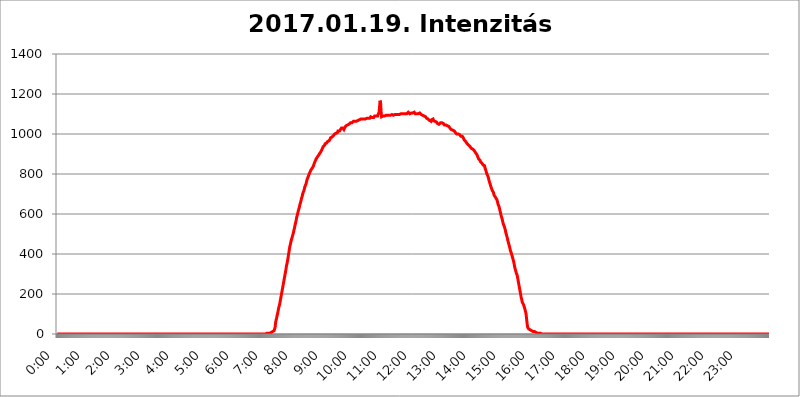
| Category | 2017.01.19. Intenzitás [W/m^2] |
|---|---|
| 0.0 | 0 |
| 0.0006944444444444445 | 0 |
| 0.001388888888888889 | 0 |
| 0.0020833333333333333 | 0 |
| 0.002777777777777778 | 0 |
| 0.003472222222222222 | 0 |
| 0.004166666666666667 | 0 |
| 0.004861111111111111 | 0 |
| 0.005555555555555556 | 0 |
| 0.0062499999999999995 | 0 |
| 0.006944444444444444 | 0 |
| 0.007638888888888889 | 0 |
| 0.008333333333333333 | 0 |
| 0.009027777777777779 | 0 |
| 0.009722222222222222 | 0 |
| 0.010416666666666666 | 0 |
| 0.011111111111111112 | 0 |
| 0.011805555555555555 | 0 |
| 0.012499999999999999 | 0 |
| 0.013194444444444444 | 0 |
| 0.013888888888888888 | 0 |
| 0.014583333333333332 | 0 |
| 0.015277777777777777 | 0 |
| 0.015972222222222224 | 0 |
| 0.016666666666666666 | 0 |
| 0.017361111111111112 | 0 |
| 0.018055555555555557 | 0 |
| 0.01875 | 0 |
| 0.019444444444444445 | 0 |
| 0.02013888888888889 | 0 |
| 0.020833333333333332 | 0 |
| 0.02152777777777778 | 0 |
| 0.022222222222222223 | 0 |
| 0.02291666666666667 | 0 |
| 0.02361111111111111 | 0 |
| 0.024305555555555556 | 0 |
| 0.024999999999999998 | 0 |
| 0.025694444444444447 | 0 |
| 0.02638888888888889 | 0 |
| 0.027083333333333334 | 0 |
| 0.027777777777777776 | 0 |
| 0.02847222222222222 | 0 |
| 0.029166666666666664 | 0 |
| 0.029861111111111113 | 0 |
| 0.030555555555555555 | 0 |
| 0.03125 | 0 |
| 0.03194444444444445 | 0 |
| 0.03263888888888889 | 0 |
| 0.03333333333333333 | 0 |
| 0.034027777777777775 | 0 |
| 0.034722222222222224 | 0 |
| 0.035416666666666666 | 0 |
| 0.036111111111111115 | 0 |
| 0.03680555555555556 | 0 |
| 0.0375 | 0 |
| 0.03819444444444444 | 0 |
| 0.03888888888888889 | 0 |
| 0.03958333333333333 | 0 |
| 0.04027777777777778 | 0 |
| 0.04097222222222222 | 0 |
| 0.041666666666666664 | 0 |
| 0.042361111111111106 | 0 |
| 0.04305555555555556 | 0 |
| 0.043750000000000004 | 0 |
| 0.044444444444444446 | 0 |
| 0.04513888888888889 | 0 |
| 0.04583333333333334 | 0 |
| 0.04652777777777778 | 0 |
| 0.04722222222222222 | 0 |
| 0.04791666666666666 | 0 |
| 0.04861111111111111 | 0 |
| 0.049305555555555554 | 0 |
| 0.049999999999999996 | 0 |
| 0.05069444444444445 | 0 |
| 0.051388888888888894 | 0 |
| 0.052083333333333336 | 0 |
| 0.05277777777777778 | 0 |
| 0.05347222222222222 | 0 |
| 0.05416666666666667 | 0 |
| 0.05486111111111111 | 0 |
| 0.05555555555555555 | 0 |
| 0.05625 | 0 |
| 0.05694444444444444 | 0 |
| 0.057638888888888885 | 0 |
| 0.05833333333333333 | 0 |
| 0.05902777777777778 | 0 |
| 0.059722222222222225 | 0 |
| 0.06041666666666667 | 0 |
| 0.061111111111111116 | 0 |
| 0.06180555555555556 | 0 |
| 0.0625 | 0 |
| 0.06319444444444444 | 0 |
| 0.06388888888888888 | 0 |
| 0.06458333333333334 | 0 |
| 0.06527777777777778 | 0 |
| 0.06597222222222222 | 0 |
| 0.06666666666666667 | 0 |
| 0.06736111111111111 | 0 |
| 0.06805555555555555 | 0 |
| 0.06874999999999999 | 0 |
| 0.06944444444444443 | 0 |
| 0.07013888888888889 | 0 |
| 0.07083333333333333 | 0 |
| 0.07152777777777779 | 0 |
| 0.07222222222222223 | 0 |
| 0.07291666666666667 | 0 |
| 0.07361111111111111 | 0 |
| 0.07430555555555556 | 0 |
| 0.075 | 0 |
| 0.07569444444444444 | 0 |
| 0.0763888888888889 | 0 |
| 0.07708333333333334 | 0 |
| 0.07777777777777778 | 0 |
| 0.07847222222222222 | 0 |
| 0.07916666666666666 | 0 |
| 0.0798611111111111 | 0 |
| 0.08055555555555556 | 0 |
| 0.08125 | 0 |
| 0.08194444444444444 | 0 |
| 0.08263888888888889 | 0 |
| 0.08333333333333333 | 0 |
| 0.08402777777777777 | 0 |
| 0.08472222222222221 | 0 |
| 0.08541666666666665 | 0 |
| 0.08611111111111112 | 0 |
| 0.08680555555555557 | 0 |
| 0.08750000000000001 | 0 |
| 0.08819444444444445 | 0 |
| 0.08888888888888889 | 0 |
| 0.08958333333333333 | 0 |
| 0.09027777777777778 | 0 |
| 0.09097222222222222 | 0 |
| 0.09166666666666667 | 0 |
| 0.09236111111111112 | 0 |
| 0.09305555555555556 | 0 |
| 0.09375 | 0 |
| 0.09444444444444444 | 0 |
| 0.09513888888888888 | 0 |
| 0.09583333333333333 | 0 |
| 0.09652777777777777 | 0 |
| 0.09722222222222222 | 0 |
| 0.09791666666666667 | 0 |
| 0.09861111111111111 | 0 |
| 0.09930555555555555 | 0 |
| 0.09999999999999999 | 0 |
| 0.10069444444444443 | 0 |
| 0.1013888888888889 | 0 |
| 0.10208333333333335 | 0 |
| 0.10277777777777779 | 0 |
| 0.10347222222222223 | 0 |
| 0.10416666666666667 | 0 |
| 0.10486111111111111 | 0 |
| 0.10555555555555556 | 0 |
| 0.10625 | 0 |
| 0.10694444444444444 | 0 |
| 0.1076388888888889 | 0 |
| 0.10833333333333334 | 0 |
| 0.10902777777777778 | 0 |
| 0.10972222222222222 | 0 |
| 0.1111111111111111 | 0 |
| 0.11180555555555556 | 0 |
| 0.11180555555555556 | 0 |
| 0.1125 | 0 |
| 0.11319444444444444 | 0 |
| 0.11388888888888889 | 0 |
| 0.11458333333333333 | 0 |
| 0.11527777777777777 | 0 |
| 0.11597222222222221 | 0 |
| 0.11666666666666665 | 0 |
| 0.1173611111111111 | 0 |
| 0.11805555555555557 | 0 |
| 0.11944444444444445 | 0 |
| 0.12013888888888889 | 0 |
| 0.12083333333333333 | 0 |
| 0.12152777777777778 | 0 |
| 0.12222222222222223 | 0 |
| 0.12291666666666667 | 0 |
| 0.12291666666666667 | 0 |
| 0.12361111111111112 | 0 |
| 0.12430555555555556 | 0 |
| 0.125 | 0 |
| 0.12569444444444444 | 0 |
| 0.12638888888888888 | 0 |
| 0.12708333333333333 | 0 |
| 0.16875 | 0 |
| 0.12847222222222224 | 0 |
| 0.12916666666666668 | 0 |
| 0.12986111111111112 | 0 |
| 0.13055555555555556 | 0 |
| 0.13125 | 0 |
| 0.13194444444444445 | 0 |
| 0.1326388888888889 | 0 |
| 0.13333333333333333 | 0 |
| 0.13402777777777777 | 0 |
| 0.13402777777777777 | 0 |
| 0.13472222222222222 | 0 |
| 0.13541666666666666 | 0 |
| 0.1361111111111111 | 0 |
| 0.13749999999999998 | 0 |
| 0.13819444444444443 | 0 |
| 0.1388888888888889 | 0 |
| 0.13958333333333334 | 0 |
| 0.14027777777777778 | 0 |
| 0.14097222222222222 | 0 |
| 0.14166666666666666 | 0 |
| 0.1423611111111111 | 0 |
| 0.14305555555555557 | 0 |
| 0.14375000000000002 | 0 |
| 0.14444444444444446 | 0 |
| 0.1451388888888889 | 0 |
| 0.1451388888888889 | 0 |
| 0.14652777777777778 | 0 |
| 0.14722222222222223 | 0 |
| 0.14791666666666667 | 0 |
| 0.1486111111111111 | 0 |
| 0.14930555555555555 | 0 |
| 0.15 | 0 |
| 0.15069444444444444 | 0 |
| 0.15138888888888888 | 0 |
| 0.15208333333333332 | 0 |
| 0.15277777777777776 | 0 |
| 0.15347222222222223 | 0 |
| 0.15416666666666667 | 0 |
| 0.15486111111111112 | 0 |
| 0.15555555555555556 | 0 |
| 0.15625 | 0 |
| 0.15694444444444444 | 0 |
| 0.15763888888888888 | 0 |
| 0.15833333333333333 | 0 |
| 0.15902777777777777 | 0 |
| 0.15972222222222224 | 0 |
| 0.16041666666666668 | 0 |
| 0.16111111111111112 | 0 |
| 0.16180555555555556 | 0 |
| 0.1625 | 0 |
| 0.16319444444444445 | 0 |
| 0.1638888888888889 | 0 |
| 0.16458333333333333 | 0 |
| 0.16527777777777777 | 0 |
| 0.16597222222222222 | 0 |
| 0.16666666666666666 | 0 |
| 0.1673611111111111 | 0 |
| 0.16805555555555554 | 0 |
| 0.16874999999999998 | 0 |
| 0.16944444444444443 | 0 |
| 0.17013888888888887 | 0 |
| 0.1708333333333333 | 0 |
| 0.17152777777777775 | 0 |
| 0.17222222222222225 | 0 |
| 0.1729166666666667 | 0 |
| 0.17361111111111113 | 0 |
| 0.17430555555555557 | 0 |
| 0.17500000000000002 | 0 |
| 0.17569444444444446 | 0 |
| 0.1763888888888889 | 0 |
| 0.17708333333333334 | 0 |
| 0.17777777777777778 | 0 |
| 0.17847222222222223 | 0 |
| 0.17916666666666667 | 0 |
| 0.1798611111111111 | 0 |
| 0.18055555555555555 | 0 |
| 0.18125 | 0 |
| 0.18194444444444444 | 0 |
| 0.1826388888888889 | 0 |
| 0.18333333333333335 | 0 |
| 0.1840277777777778 | 0 |
| 0.18472222222222223 | 0 |
| 0.18541666666666667 | 0 |
| 0.18611111111111112 | 0 |
| 0.18680555555555556 | 0 |
| 0.1875 | 0 |
| 0.18819444444444444 | 0 |
| 0.18888888888888888 | 0 |
| 0.18958333333333333 | 0 |
| 0.19027777777777777 | 0 |
| 0.1909722222222222 | 0 |
| 0.19166666666666665 | 0 |
| 0.19236111111111112 | 0 |
| 0.19305555555555554 | 0 |
| 0.19375 | 0 |
| 0.19444444444444445 | 0 |
| 0.1951388888888889 | 0 |
| 0.19583333333333333 | 0 |
| 0.19652777777777777 | 0 |
| 0.19722222222222222 | 0 |
| 0.19791666666666666 | 0 |
| 0.1986111111111111 | 0 |
| 0.19930555555555554 | 0 |
| 0.19999999999999998 | 0 |
| 0.20069444444444443 | 0 |
| 0.20138888888888887 | 0 |
| 0.2020833333333333 | 0 |
| 0.2027777777777778 | 0 |
| 0.2034722222222222 | 0 |
| 0.2041666666666667 | 0 |
| 0.20486111111111113 | 0 |
| 0.20555555555555557 | 0 |
| 0.20625000000000002 | 0 |
| 0.20694444444444446 | 0 |
| 0.2076388888888889 | 0 |
| 0.20833333333333334 | 0 |
| 0.20902777777777778 | 0 |
| 0.20972222222222223 | 0 |
| 0.21041666666666667 | 0 |
| 0.2111111111111111 | 0 |
| 0.21180555555555555 | 0 |
| 0.2125 | 0 |
| 0.21319444444444444 | 0 |
| 0.2138888888888889 | 0 |
| 0.21458333333333335 | 0 |
| 0.2152777777777778 | 0 |
| 0.21597222222222223 | 0 |
| 0.21666666666666667 | 0 |
| 0.21736111111111112 | 0 |
| 0.21805555555555556 | 0 |
| 0.21875 | 0 |
| 0.21944444444444444 | 0 |
| 0.22013888888888888 | 0 |
| 0.22083333333333333 | 0 |
| 0.22152777777777777 | 0 |
| 0.2222222222222222 | 0 |
| 0.22291666666666665 | 0 |
| 0.2236111111111111 | 0 |
| 0.22430555555555556 | 0 |
| 0.225 | 0 |
| 0.22569444444444445 | 0 |
| 0.2263888888888889 | 0 |
| 0.22708333333333333 | 0 |
| 0.22777777777777777 | 0 |
| 0.22847222222222222 | 0 |
| 0.22916666666666666 | 0 |
| 0.2298611111111111 | 0 |
| 0.23055555555555554 | 0 |
| 0.23124999999999998 | 0 |
| 0.23194444444444443 | 0 |
| 0.23263888888888887 | 0 |
| 0.2333333333333333 | 0 |
| 0.2340277777777778 | 0 |
| 0.2347222222222222 | 0 |
| 0.2354166666666667 | 0 |
| 0.23611111111111113 | 0 |
| 0.23680555555555557 | 0 |
| 0.23750000000000002 | 0 |
| 0.23819444444444446 | 0 |
| 0.2388888888888889 | 0 |
| 0.23958333333333334 | 0 |
| 0.24027777777777778 | 0 |
| 0.24097222222222223 | 0 |
| 0.24166666666666667 | 0 |
| 0.2423611111111111 | 0 |
| 0.24305555555555555 | 0 |
| 0.24375 | 0 |
| 0.24444444444444446 | 0 |
| 0.24513888888888888 | 0 |
| 0.24583333333333335 | 0 |
| 0.2465277777777778 | 0 |
| 0.24722222222222223 | 0 |
| 0.24791666666666667 | 0 |
| 0.24861111111111112 | 0 |
| 0.24930555555555556 | 0 |
| 0.25 | 0 |
| 0.25069444444444444 | 0 |
| 0.2513888888888889 | 0 |
| 0.2520833333333333 | 0 |
| 0.25277777777777777 | 0 |
| 0.2534722222222222 | 0 |
| 0.25416666666666665 | 0 |
| 0.2548611111111111 | 0 |
| 0.2555555555555556 | 0 |
| 0.25625000000000003 | 0 |
| 0.2569444444444445 | 0 |
| 0.2576388888888889 | 0 |
| 0.25833333333333336 | 0 |
| 0.2590277777777778 | 0 |
| 0.25972222222222224 | 0 |
| 0.2604166666666667 | 0 |
| 0.2611111111111111 | 0 |
| 0.26180555555555557 | 0 |
| 0.2625 | 0 |
| 0.26319444444444445 | 0 |
| 0.2638888888888889 | 0 |
| 0.26458333333333334 | 0 |
| 0.2652777777777778 | 0 |
| 0.2659722222222222 | 0 |
| 0.26666666666666666 | 0 |
| 0.2673611111111111 | 0 |
| 0.26805555555555555 | 0 |
| 0.26875 | 0 |
| 0.26944444444444443 | 0 |
| 0.2701388888888889 | 0 |
| 0.2708333333333333 | 0 |
| 0.27152777777777776 | 0 |
| 0.2722222222222222 | 0 |
| 0.27291666666666664 | 0 |
| 0.2736111111111111 | 0 |
| 0.2743055555555555 | 0 |
| 0.27499999999999997 | 0 |
| 0.27569444444444446 | 0 |
| 0.27638888888888885 | 0 |
| 0.27708333333333335 | 0 |
| 0.2777777777777778 | 0 |
| 0.27847222222222223 | 0 |
| 0.2791666666666667 | 0 |
| 0.2798611111111111 | 0 |
| 0.28055555555555556 | 0 |
| 0.28125 | 0 |
| 0.28194444444444444 | 0 |
| 0.2826388888888889 | 0 |
| 0.2833333333333333 | 0 |
| 0.28402777777777777 | 0 |
| 0.2847222222222222 | 0 |
| 0.28541666666666665 | 0 |
| 0.28611111111111115 | 0 |
| 0.28680555555555554 | 0 |
| 0.28750000000000003 | 0 |
| 0.2881944444444445 | 0 |
| 0.2888888888888889 | 0 |
| 0.28958333333333336 | 0 |
| 0.2902777777777778 | 0 |
| 0.29097222222222224 | 0 |
| 0.2916666666666667 | 0 |
| 0.2923611111111111 | 0 |
| 0.29305555555555557 | 3.525 |
| 0.29375 | 3.525 |
| 0.29444444444444445 | 3.525 |
| 0.2951388888888889 | 3.525 |
| 0.29583333333333334 | 3.525 |
| 0.2965277777777778 | 3.525 |
| 0.2972222222222222 | 3.525 |
| 0.29791666666666666 | 3.525 |
| 0.2986111111111111 | 3.525 |
| 0.29930555555555555 | 7.887 |
| 0.3 | 7.887 |
| 0.30069444444444443 | 7.887 |
| 0.3013888888888889 | 12.257 |
| 0.3020833333333333 | 12.257 |
| 0.30277777777777776 | 12.257 |
| 0.3034722222222222 | 12.257 |
| 0.30416666666666664 | 16.636 |
| 0.3048611111111111 | 16.636 |
| 0.3055555555555555 | 34.234 |
| 0.30624999999999997 | 56.398 |
| 0.3069444444444444 | 69.775 |
| 0.3076388888888889 | 78.722 |
| 0.30833333333333335 | 92.184 |
| 0.3090277777777778 | 101.184 |
| 0.30972222222222223 | 114.716 |
| 0.3104166666666667 | 128.284 |
| 0.3111111111111111 | 137.347 |
| 0.31180555555555556 | 146.423 |
| 0.3125 | 160.056 |
| 0.31319444444444444 | 173.709 |
| 0.3138888888888889 | 187.378 |
| 0.3145833333333333 | 201.058 |
| 0.31527777777777777 | 214.746 |
| 0.3159722222222222 | 228.436 |
| 0.31666666666666665 | 242.127 |
| 0.31736111111111115 | 255.813 |
| 0.31805555555555554 | 269.49 |
| 0.31875000000000003 | 283.156 |
| 0.3194444444444445 | 296.808 |
| 0.3201388888888889 | 310.44 |
| 0.32083333333333336 | 324.052 |
| 0.3215277777777778 | 342.162 |
| 0.32222222222222224 | 351.198 |
| 0.3229166666666667 | 364.728 |
| 0.3236111111111111 | 378.224 |
| 0.32430555555555557 | 396.164 |
| 0.325 | 409.574 |
| 0.32569444444444445 | 427.39 |
| 0.3263888888888889 | 440.702 |
| 0.32708333333333334 | 449.551 |
| 0.3277777777777778 | 462.786 |
| 0.3284722222222222 | 471.582 |
| 0.32916666666666666 | 480.356 |
| 0.3298611111111111 | 489.108 |
| 0.33055555555555555 | 493.475 |
| 0.33125 | 506.542 |
| 0.33194444444444443 | 519.555 |
| 0.3326388888888889 | 528.2 |
| 0.3333333333333333 | 541.121 |
| 0.3340277777777778 | 545.416 |
| 0.3347222222222222 | 562.53 |
| 0.3354166666666667 | 575.299 |
| 0.3361111111111111 | 588.009 |
| 0.3368055555555556 | 596.45 |
| 0.33749999999999997 | 600.661 |
| 0.33819444444444446 | 617.436 |
| 0.33888888888888885 | 625.784 |
| 0.33958333333333335 | 634.105 |
| 0.34027777777777773 | 646.537 |
| 0.34097222222222223 | 654.791 |
| 0.3416666666666666 | 663.019 |
| 0.3423611111111111 | 675.311 |
| 0.3430555555555555 | 683.473 |
| 0.34375 | 691.608 |
| 0.3444444444444445 | 703.762 |
| 0.3451388888888889 | 707.8 |
| 0.3458333333333334 | 715.858 |
| 0.34652777777777777 | 723.889 |
| 0.34722222222222227 | 735.89 |
| 0.34791666666666665 | 739.877 |
| 0.34861111111111115 | 747.834 |
| 0.34930555555555554 | 755.766 |
| 0.35000000000000003 | 767.62 |
| 0.3506944444444444 | 775.492 |
| 0.3513888888888889 | 779.42 |
| 0.3520833333333333 | 787.258 |
| 0.3527777777777778 | 795.074 |
| 0.3534722222222222 | 798.974 |
| 0.3541666666666667 | 806.757 |
| 0.3548611111111111 | 806.757 |
| 0.35555555555555557 | 818.392 |
| 0.35625 | 818.392 |
| 0.35694444444444445 | 826.123 |
| 0.3576388888888889 | 826.123 |
| 0.35833333333333334 | 829.981 |
| 0.3590277777777778 | 837.682 |
| 0.3597222222222222 | 845.365 |
| 0.36041666666666666 | 853.029 |
| 0.3611111111111111 | 856.855 |
| 0.36180555555555555 | 864.493 |
| 0.3625 | 868.305 |
| 0.36319444444444443 | 875.918 |
| 0.3638888888888889 | 879.719 |
| 0.3645833333333333 | 883.516 |
| 0.3652777777777778 | 887.309 |
| 0.3659722222222222 | 891.099 |
| 0.3666666666666667 | 894.885 |
| 0.3673611111111111 | 898.668 |
| 0.3680555555555556 | 902.447 |
| 0.36874999999999997 | 906.223 |
| 0.36944444444444446 | 909.996 |
| 0.37013888888888885 | 913.766 |
| 0.37083333333333335 | 917.534 |
| 0.37152777777777773 | 925.06 |
| 0.37222222222222223 | 925.06 |
| 0.3729166666666666 | 936.33 |
| 0.3736111111111111 | 936.33 |
| 0.3743055555555555 | 940.082 |
| 0.375 | 943.832 |
| 0.3756944444444445 | 951.327 |
| 0.3763888888888889 | 951.327 |
| 0.3770833333333334 | 951.327 |
| 0.37777777777777777 | 955.071 |
| 0.37847222222222227 | 955.071 |
| 0.37916666666666665 | 962.555 |
| 0.37986111111111115 | 966.295 |
| 0.38055555555555554 | 966.295 |
| 0.38125000000000003 | 966.295 |
| 0.3819444444444444 | 970.034 |
| 0.3826388888888889 | 973.772 |
| 0.3833333333333333 | 981.244 |
| 0.3840277777777778 | 984.98 |
| 0.3847222222222222 | 984.98 |
| 0.3854166666666667 | 984.98 |
| 0.3861111111111111 | 988.714 |
| 0.38680555555555557 | 988.714 |
| 0.3875 | 992.448 |
| 0.38819444444444445 | 996.182 |
| 0.3888888888888889 | 999.916 |
| 0.38958333333333334 | 999.916 |
| 0.3902777777777778 | 1003.65 |
| 0.3909722222222222 | 1003.65 |
| 0.39166666666666666 | 1007.383 |
| 0.3923611111111111 | 1007.383 |
| 0.39305555555555555 | 1007.383 |
| 0.39375 | 1014.852 |
| 0.39444444444444443 | 1014.852 |
| 0.3951388888888889 | 1014.852 |
| 0.3958333333333333 | 1014.852 |
| 0.3965277777777778 | 1018.587 |
| 0.3972222222222222 | 1022.323 |
| 0.3979166666666667 | 1026.06 |
| 0.3986111111111111 | 1029.798 |
| 0.3993055555555556 | 1026.06 |
| 0.39999999999999997 | 1026.06 |
| 0.40069444444444446 | 1029.798 |
| 0.40138888888888885 | 1026.06 |
| 0.40208333333333335 | 1022.323 |
| 0.40277777777777773 | 1026.06 |
| 0.40347222222222223 | 1033.537 |
| 0.4041666666666666 | 1033.537 |
| 0.4048611111111111 | 1041.019 |
| 0.4055555555555555 | 1041.019 |
| 0.40625 | 1044.762 |
| 0.4069444444444445 | 1044.762 |
| 0.4076388888888889 | 1044.762 |
| 0.4083333333333334 | 1048.508 |
| 0.40902777777777777 | 1048.508 |
| 0.40972222222222227 | 1048.508 |
| 0.41041666666666665 | 1048.508 |
| 0.41111111111111115 | 1056.004 |
| 0.41180555555555554 | 1052.255 |
| 0.41250000000000003 | 1056.004 |
| 0.4131944444444444 | 1056.004 |
| 0.4138888888888889 | 1052.255 |
| 0.4145833333333333 | 1059.756 |
| 0.4152777777777778 | 1063.51 |
| 0.4159722222222222 | 1059.756 |
| 0.4166666666666667 | 1063.51 |
| 0.4173611111111111 | 1063.51 |
| 0.41805555555555557 | 1063.51 |
| 0.41875 | 1063.51 |
| 0.41944444444444445 | 1063.51 |
| 0.4201388888888889 | 1063.51 |
| 0.42083333333333334 | 1067.267 |
| 0.4215277777777778 | 1067.267 |
| 0.4222222222222222 | 1067.267 |
| 0.42291666666666666 | 1071.027 |
| 0.4236111111111111 | 1071.027 |
| 0.42430555555555555 | 1071.027 |
| 0.425 | 1071.027 |
| 0.42569444444444443 | 1074.789 |
| 0.4263888888888889 | 1074.789 |
| 0.4270833333333333 | 1074.789 |
| 0.4277777777777778 | 1074.789 |
| 0.4284722222222222 | 1074.789 |
| 0.4291666666666667 | 1074.789 |
| 0.4298611111111111 | 1074.789 |
| 0.4305555555555556 | 1074.789 |
| 0.43124999999999997 | 1074.789 |
| 0.43194444444444446 | 1074.789 |
| 0.43263888888888885 | 1074.789 |
| 0.43333333333333335 | 1074.789 |
| 0.43402777777777773 | 1078.555 |
| 0.43472222222222223 | 1078.555 |
| 0.4354166666666666 | 1078.555 |
| 0.4361111111111111 | 1078.555 |
| 0.4368055555555555 | 1082.324 |
| 0.4375 | 1082.324 |
| 0.4381944444444445 | 1078.555 |
| 0.4388888888888889 | 1082.324 |
| 0.4395833333333334 | 1086.097 |
| 0.44027777777777777 | 1082.324 |
| 0.44097222222222227 | 1082.324 |
| 0.44166666666666665 | 1082.324 |
| 0.44236111111111115 | 1086.097 |
| 0.44305555555555554 | 1086.097 |
| 0.44375000000000003 | 1082.324 |
| 0.4444444444444444 | 1086.097 |
| 0.4451388888888889 | 1089.873 |
| 0.4458333333333333 | 1089.873 |
| 0.4465277777777778 | 1089.873 |
| 0.4472222222222222 | 1089.873 |
| 0.4479166666666667 | 1089.873 |
| 0.4486111111111111 | 1089.873 |
| 0.44930555555555557 | 1089.873 |
| 0.45 | 1097.437 |
| 0.45069444444444445 | 1101.226 |
| 0.4513888888888889 | 1108.816 |
| 0.45208333333333334 | 1135.543 |
| 0.4527777777777778 | 1166.46 |
| 0.4534722222222222 | 1158.689 |
| 0.45416666666666666 | 1112.618 |
| 0.4548611111111111 | 1086.097 |
| 0.45555555555555555 | 1086.097 |
| 0.45625 | 1089.873 |
| 0.45694444444444443 | 1089.873 |
| 0.4576388888888889 | 1089.873 |
| 0.4583333333333333 | 1089.873 |
| 0.4590277777777778 | 1089.873 |
| 0.4597222222222222 | 1093.653 |
| 0.4604166666666667 | 1093.653 |
| 0.4611111111111111 | 1093.653 |
| 0.4618055555555556 | 1097.437 |
| 0.46249999999999997 | 1093.653 |
| 0.46319444444444446 | 1093.653 |
| 0.46388888888888885 | 1093.653 |
| 0.46458333333333335 | 1093.653 |
| 0.46527777777777773 | 1093.653 |
| 0.46597222222222223 | 1093.653 |
| 0.4666666666666666 | 1093.653 |
| 0.4673611111111111 | 1093.653 |
| 0.4680555555555555 | 1097.437 |
| 0.46875 | 1097.437 |
| 0.4694444444444445 | 1097.437 |
| 0.4701388888888889 | 1101.226 |
| 0.4708333333333334 | 1097.437 |
| 0.47152777777777777 | 1093.653 |
| 0.47222222222222227 | 1093.653 |
| 0.47291666666666665 | 1093.653 |
| 0.47361111111111115 | 1097.437 |
| 0.47430555555555554 | 1097.437 |
| 0.47500000000000003 | 1097.437 |
| 0.4756944444444444 | 1097.437 |
| 0.4763888888888889 | 1097.437 |
| 0.4770833333333333 | 1097.437 |
| 0.4777777777777778 | 1097.437 |
| 0.4784722222222222 | 1097.437 |
| 0.4791666666666667 | 1097.437 |
| 0.4798611111111111 | 1097.437 |
| 0.48055555555555557 | 1097.437 |
| 0.48125 | 1101.226 |
| 0.48194444444444445 | 1101.226 |
| 0.4826388888888889 | 1101.226 |
| 0.48333333333333334 | 1101.226 |
| 0.4840277777777778 | 1101.226 |
| 0.4847222222222222 | 1101.226 |
| 0.48541666666666666 | 1101.226 |
| 0.4861111111111111 | 1101.226 |
| 0.48680555555555555 | 1101.226 |
| 0.4875 | 1101.226 |
| 0.48819444444444443 | 1101.226 |
| 0.4888888888888889 | 1101.226 |
| 0.4895833333333333 | 1101.226 |
| 0.4902777777777778 | 1101.226 |
| 0.4909722222222222 | 1101.226 |
| 0.4916666666666667 | 1101.226 |
| 0.4923611111111111 | 1108.816 |
| 0.4930555555555556 | 1105.019 |
| 0.49374999999999997 | 1105.019 |
| 0.49444444444444446 | 1101.226 |
| 0.49513888888888885 | 1105.019 |
| 0.49583333333333335 | 1105.019 |
| 0.49652777777777773 | 1105.019 |
| 0.49722222222222223 | 1105.019 |
| 0.4979166666666666 | 1105.019 |
| 0.4986111111111111 | 1105.019 |
| 0.4993055555555555 | 1105.019 |
| 0.5 | 1105.019 |
| 0.5006944444444444 | 1108.816 |
| 0.5013888888888889 | 1105.019 |
| 0.5020833333333333 | 1101.226 |
| 0.5027777777777778 | 1101.226 |
| 0.5034722222222222 | 1097.437 |
| 0.5041666666666667 | 1101.226 |
| 0.5048611111111111 | 1105.019 |
| 0.5055555555555555 | 1101.226 |
| 0.50625 | 1101.226 |
| 0.5069444444444444 | 1101.226 |
| 0.5076388888888889 | 1101.226 |
| 0.5083333333333333 | 1105.019 |
| 0.5090277777777777 | 1101.226 |
| 0.5097222222222222 | 1101.226 |
| 0.5104166666666666 | 1097.437 |
| 0.5111111111111112 | 1093.653 |
| 0.5118055555555555 | 1093.653 |
| 0.5125000000000001 | 1093.653 |
| 0.5131944444444444 | 1093.653 |
| 0.513888888888889 | 1089.873 |
| 0.5145833333333333 | 1089.873 |
| 0.5152777777777778 | 1086.097 |
| 0.5159722222222222 | 1089.873 |
| 0.5166666666666667 | 1086.097 |
| 0.517361111111111 | 1082.324 |
| 0.5180555555555556 | 1078.555 |
| 0.5187499999999999 | 1074.789 |
| 0.5194444444444445 | 1074.789 |
| 0.5201388888888888 | 1074.789 |
| 0.5208333333333334 | 1074.789 |
| 0.5215277777777778 | 1074.789 |
| 0.5222222222222223 | 1067.267 |
| 0.5229166666666667 | 1067.267 |
| 0.5236111111111111 | 1063.51 |
| 0.5243055555555556 | 1063.51 |
| 0.525 | 1071.027 |
| 0.5256944444444445 | 1071.027 |
| 0.5263888888888889 | 1074.789 |
| 0.5270833333333333 | 1074.789 |
| 0.5277777777777778 | 1067.267 |
| 0.5284722222222222 | 1067.267 |
| 0.5291666666666667 | 1067.267 |
| 0.5298611111111111 | 1063.51 |
| 0.5305555555555556 | 1059.756 |
| 0.53125 | 1059.756 |
| 0.5319444444444444 | 1059.756 |
| 0.5326388888888889 | 1056.004 |
| 0.5333333333333333 | 1052.255 |
| 0.5340277777777778 | 1052.255 |
| 0.5347222222222222 | 1048.508 |
| 0.5354166666666667 | 1048.508 |
| 0.5361111111111111 | 1048.508 |
| 0.5368055555555555 | 1052.255 |
| 0.5375 | 1056.004 |
| 0.5381944444444444 | 1056.004 |
| 0.5388888888888889 | 1059.756 |
| 0.5395833333333333 | 1056.004 |
| 0.5402777777777777 | 1056.004 |
| 0.5409722222222222 | 1056.004 |
| 0.5416666666666666 | 1052.255 |
| 0.5423611111111112 | 1052.255 |
| 0.5430555555555555 | 1044.762 |
| 0.5437500000000001 | 1044.762 |
| 0.5444444444444444 | 1044.762 |
| 0.545138888888889 | 1044.762 |
| 0.5458333333333333 | 1044.762 |
| 0.5465277777777778 | 1044.762 |
| 0.5472222222222222 | 1041.019 |
| 0.5479166666666667 | 1041.019 |
| 0.548611111111111 | 1037.277 |
| 0.5493055555555556 | 1037.277 |
| 0.5499999999999999 | 1037.277 |
| 0.5506944444444445 | 1029.798 |
| 0.5513888888888888 | 1026.06 |
| 0.5520833333333334 | 1026.06 |
| 0.5527777777777778 | 1022.323 |
| 0.5534722222222223 | 1022.323 |
| 0.5541666666666667 | 1018.587 |
| 0.5548611111111111 | 1018.587 |
| 0.5555555555555556 | 1014.852 |
| 0.55625 | 1014.852 |
| 0.5569444444444445 | 1014.852 |
| 0.5576388888888889 | 1011.118 |
| 0.5583333333333333 | 1007.383 |
| 0.5590277777777778 | 1003.65 |
| 0.5597222222222222 | 1003.65 |
| 0.5604166666666667 | 999.916 |
| 0.5611111111111111 | 1003.65 |
| 0.5618055555555556 | 999.916 |
| 0.5625 | 999.916 |
| 0.5631944444444444 | 999.916 |
| 0.5638888888888889 | 996.182 |
| 0.5645833333333333 | 996.182 |
| 0.5652777777777778 | 992.448 |
| 0.5659722222222222 | 988.714 |
| 0.5666666666666667 | 988.714 |
| 0.5673611111111111 | 988.714 |
| 0.5680555555555555 | 988.714 |
| 0.56875 | 984.98 |
| 0.5694444444444444 | 981.244 |
| 0.5701388888888889 | 977.508 |
| 0.5708333333333333 | 970.034 |
| 0.5715277777777777 | 970.034 |
| 0.5722222222222222 | 970.034 |
| 0.5729166666666666 | 962.555 |
| 0.5736111111111112 | 962.555 |
| 0.5743055555555555 | 962.555 |
| 0.5750000000000001 | 951.327 |
| 0.5756944444444444 | 951.327 |
| 0.576388888888889 | 947.58 |
| 0.5770833333333333 | 943.832 |
| 0.5777777777777778 | 940.082 |
| 0.5784722222222222 | 940.082 |
| 0.5791666666666667 | 936.33 |
| 0.579861111111111 | 932.576 |
| 0.5805555555555556 | 928.819 |
| 0.5812499999999999 | 928.819 |
| 0.5819444444444445 | 925.06 |
| 0.5826388888888888 | 925.06 |
| 0.5833333333333334 | 925.06 |
| 0.5840277777777778 | 925.06 |
| 0.5847222222222223 | 917.534 |
| 0.5854166666666667 | 917.534 |
| 0.5861111111111111 | 909.996 |
| 0.5868055555555556 | 906.223 |
| 0.5875 | 902.447 |
| 0.5881944444444445 | 898.668 |
| 0.5888888888888889 | 894.885 |
| 0.5895833333333333 | 887.309 |
| 0.5902777777777778 | 883.516 |
| 0.5909722222222222 | 875.918 |
| 0.5916666666666667 | 875.918 |
| 0.5923611111111111 | 872.114 |
| 0.5930555555555556 | 868.305 |
| 0.59375 | 860.676 |
| 0.5944444444444444 | 856.855 |
| 0.5951388888888889 | 856.855 |
| 0.5958333333333333 | 853.029 |
| 0.5965277777777778 | 849.199 |
| 0.5972222222222222 | 845.365 |
| 0.5979166666666667 | 845.365 |
| 0.5986111111111111 | 841.526 |
| 0.5993055555555555 | 841.526 |
| 0.6 | 829.981 |
| 0.6006944444444444 | 822.26 |
| 0.6013888888888889 | 814.519 |
| 0.6020833333333333 | 810.641 |
| 0.6027777777777777 | 798.974 |
| 0.6034722222222222 | 795.074 |
| 0.6041666666666666 | 787.258 |
| 0.6048611111111112 | 779.42 |
| 0.6055555555555555 | 767.62 |
| 0.6062500000000001 | 759.723 |
| 0.6069444444444444 | 751.803 |
| 0.607638888888889 | 743.859 |
| 0.6083333333333333 | 735.89 |
| 0.6090277777777778 | 727.896 |
| 0.6097222222222222 | 723.889 |
| 0.6104166666666667 | 715.858 |
| 0.611111111111111 | 711.832 |
| 0.6118055555555556 | 707.8 |
| 0.6124999999999999 | 695.666 |
| 0.6131944444444445 | 691.608 |
| 0.6138888888888888 | 687.544 |
| 0.6145833333333334 | 683.473 |
| 0.6152777777777778 | 679.395 |
| 0.6159722222222223 | 679.395 |
| 0.6166666666666667 | 671.22 |
| 0.6173611111111111 | 663.019 |
| 0.6180555555555556 | 650.667 |
| 0.61875 | 646.537 |
| 0.6194444444444445 | 638.256 |
| 0.6201388888888889 | 629.948 |
| 0.6208333333333333 | 617.436 |
| 0.6215277777777778 | 609.062 |
| 0.6222222222222222 | 596.45 |
| 0.6229166666666667 | 588.009 |
| 0.6236111111111111 | 579.542 |
| 0.6243055555555556 | 571.049 |
| 0.625 | 558.261 |
| 0.6256944444444444 | 549.704 |
| 0.6263888888888889 | 545.416 |
| 0.6270833333333333 | 536.82 |
| 0.6277777777777778 | 528.2 |
| 0.6284722222222222 | 519.555 |
| 0.6291666666666667 | 506.542 |
| 0.6298611111111111 | 497.836 |
| 0.6305555555555555 | 489.108 |
| 0.63125 | 480.356 |
| 0.6319444444444444 | 467.187 |
| 0.6326388888888889 | 458.38 |
| 0.6333333333333333 | 449.551 |
| 0.6340277777777777 | 440.702 |
| 0.6347222222222222 | 431.833 |
| 0.6354166666666666 | 418.492 |
| 0.6361111111111112 | 414.035 |
| 0.6368055555555555 | 405.108 |
| 0.6375000000000001 | 396.164 |
| 0.6381944444444444 | 387.202 |
| 0.638888888888889 | 378.224 |
| 0.6395833333333333 | 369.23 |
| 0.6402777777777778 | 360.221 |
| 0.6409722222222222 | 346.682 |
| 0.6416666666666667 | 333.113 |
| 0.642361111111111 | 324.052 |
| 0.6430555555555556 | 314.98 |
| 0.6437499999999999 | 305.898 |
| 0.6444444444444445 | 301.354 |
| 0.6451388888888888 | 292.259 |
| 0.6458333333333334 | 278.603 |
| 0.6465277777777778 | 264.932 |
| 0.6472222222222223 | 251.251 |
| 0.6479166666666667 | 237.564 |
| 0.6486111111111111 | 223.873 |
| 0.6493055555555556 | 210.182 |
| 0.65 | 196.497 |
| 0.6506944444444445 | 182.82 |
| 0.6513888888888889 | 173.709 |
| 0.6520833333333333 | 160.056 |
| 0.6527777777777778 | 155.509 |
| 0.6534722222222222 | 150.964 |
| 0.6541666666666667 | 146.423 |
| 0.6548611111111111 | 137.347 |
| 0.6555555555555556 | 128.284 |
| 0.65625 | 119.235 |
| 0.6569444444444444 | 110.201 |
| 0.6576388888888889 | 96.682 |
| 0.6583333333333333 | 74.246 |
| 0.6590277777777778 | 51.951 |
| 0.6597222222222222 | 34.234 |
| 0.6604166666666667 | 29.823 |
| 0.6611111111111111 | 25.419 |
| 0.6618055555555555 | 25.419 |
| 0.6625 | 25.419 |
| 0.6631944444444444 | 21.024 |
| 0.6638888888888889 | 21.024 |
| 0.6645833333333333 | 21.024 |
| 0.6652777777777777 | 16.636 |
| 0.6659722222222222 | 16.636 |
| 0.6666666666666666 | 16.636 |
| 0.6673611111111111 | 12.257 |
| 0.6680555555555556 | 12.257 |
| 0.6687500000000001 | 12.257 |
| 0.6694444444444444 | 12.257 |
| 0.6701388888888888 | 12.257 |
| 0.6708333333333334 | 7.887 |
| 0.6715277777777778 | 7.887 |
| 0.6722222222222222 | 7.887 |
| 0.6729166666666666 | 3.525 |
| 0.6736111111111112 | 3.525 |
| 0.6743055555555556 | 3.525 |
| 0.6749999999999999 | 3.525 |
| 0.6756944444444444 | 3.525 |
| 0.6763888888888889 | 3.525 |
| 0.6770833333333334 | 3.525 |
| 0.6777777777777777 | 3.525 |
| 0.6784722222222223 | 3.525 |
| 0.6791666666666667 | 0 |
| 0.6798611111111111 | 0 |
| 0.6805555555555555 | 0 |
| 0.68125 | 0 |
| 0.6819444444444445 | 0 |
| 0.6826388888888889 | 0 |
| 0.6833333333333332 | 0 |
| 0.6840277777777778 | 0 |
| 0.6847222222222222 | 0 |
| 0.6854166666666667 | 0 |
| 0.686111111111111 | 0 |
| 0.6868055555555556 | 0 |
| 0.6875 | 0 |
| 0.6881944444444444 | 0 |
| 0.688888888888889 | 0 |
| 0.6895833333333333 | 0 |
| 0.6902777777777778 | 0 |
| 0.6909722222222222 | 0 |
| 0.6916666666666668 | 0 |
| 0.6923611111111111 | 0 |
| 0.6930555555555555 | 0 |
| 0.69375 | 0 |
| 0.6944444444444445 | 0 |
| 0.6951388888888889 | 0 |
| 0.6958333333333333 | 0 |
| 0.6965277777777777 | 0 |
| 0.6972222222222223 | 0 |
| 0.6979166666666666 | 0 |
| 0.6986111111111111 | 0 |
| 0.6993055555555556 | 0 |
| 0.7000000000000001 | 0 |
| 0.7006944444444444 | 0 |
| 0.7013888888888888 | 0 |
| 0.7020833333333334 | 0 |
| 0.7027777777777778 | 0 |
| 0.7034722222222222 | 0 |
| 0.7041666666666666 | 0 |
| 0.7048611111111112 | 0 |
| 0.7055555555555556 | 0 |
| 0.7062499999999999 | 0 |
| 0.7069444444444444 | 0 |
| 0.7076388888888889 | 0 |
| 0.7083333333333334 | 0 |
| 0.7090277777777777 | 0 |
| 0.7097222222222223 | 0 |
| 0.7104166666666667 | 0 |
| 0.7111111111111111 | 0 |
| 0.7118055555555555 | 0 |
| 0.7125 | 0 |
| 0.7131944444444445 | 0 |
| 0.7138888888888889 | 0 |
| 0.7145833333333332 | 0 |
| 0.7152777777777778 | 0 |
| 0.7159722222222222 | 0 |
| 0.7166666666666667 | 0 |
| 0.717361111111111 | 0 |
| 0.7180555555555556 | 0 |
| 0.71875 | 0 |
| 0.7194444444444444 | 0 |
| 0.720138888888889 | 0 |
| 0.7208333333333333 | 0 |
| 0.7215277777777778 | 0 |
| 0.7222222222222222 | 0 |
| 0.7229166666666668 | 0 |
| 0.7236111111111111 | 0 |
| 0.7243055555555555 | 0 |
| 0.725 | 0 |
| 0.7256944444444445 | 0 |
| 0.7263888888888889 | 0 |
| 0.7270833333333333 | 0 |
| 0.7277777777777777 | 0 |
| 0.7284722222222223 | 0 |
| 0.7291666666666666 | 0 |
| 0.7298611111111111 | 0 |
| 0.7305555555555556 | 0 |
| 0.7312500000000001 | 0 |
| 0.7319444444444444 | 0 |
| 0.7326388888888888 | 0 |
| 0.7333333333333334 | 0 |
| 0.7340277777777778 | 0 |
| 0.7347222222222222 | 0 |
| 0.7354166666666666 | 0 |
| 0.7361111111111112 | 0 |
| 0.7368055555555556 | 0 |
| 0.7374999999999999 | 0 |
| 0.7381944444444444 | 0 |
| 0.7388888888888889 | 0 |
| 0.7395833333333334 | 0 |
| 0.7402777777777777 | 0 |
| 0.7409722222222223 | 0 |
| 0.7416666666666667 | 0 |
| 0.7423611111111111 | 0 |
| 0.7430555555555555 | 0 |
| 0.74375 | 0 |
| 0.7444444444444445 | 0 |
| 0.7451388888888889 | 0 |
| 0.7458333333333332 | 0 |
| 0.7465277777777778 | 0 |
| 0.7472222222222222 | 0 |
| 0.7479166666666667 | 0 |
| 0.748611111111111 | 0 |
| 0.7493055555555556 | 0 |
| 0.75 | 0 |
| 0.7506944444444444 | 0 |
| 0.751388888888889 | 0 |
| 0.7520833333333333 | 0 |
| 0.7527777777777778 | 0 |
| 0.7534722222222222 | 0 |
| 0.7541666666666668 | 0 |
| 0.7548611111111111 | 0 |
| 0.7555555555555555 | 0 |
| 0.75625 | 0 |
| 0.7569444444444445 | 0 |
| 0.7576388888888889 | 0 |
| 0.7583333333333333 | 0 |
| 0.7590277777777777 | 0 |
| 0.7597222222222223 | 0 |
| 0.7604166666666666 | 0 |
| 0.7611111111111111 | 0 |
| 0.7618055555555556 | 0 |
| 0.7625000000000001 | 0 |
| 0.7631944444444444 | 0 |
| 0.7638888888888888 | 0 |
| 0.7645833333333334 | 0 |
| 0.7652777777777778 | 0 |
| 0.7659722222222222 | 0 |
| 0.7666666666666666 | 0 |
| 0.7673611111111112 | 0 |
| 0.7680555555555556 | 0 |
| 0.7687499999999999 | 0 |
| 0.7694444444444444 | 0 |
| 0.7701388888888889 | 0 |
| 0.7708333333333334 | 0 |
| 0.7715277777777777 | 0 |
| 0.7722222222222223 | 0 |
| 0.7729166666666667 | 0 |
| 0.7736111111111111 | 0 |
| 0.7743055555555555 | 0 |
| 0.775 | 0 |
| 0.7756944444444445 | 0 |
| 0.7763888888888889 | 0 |
| 0.7770833333333332 | 0 |
| 0.7777777777777778 | 0 |
| 0.7784722222222222 | 0 |
| 0.7791666666666667 | 0 |
| 0.779861111111111 | 0 |
| 0.7805555555555556 | 0 |
| 0.78125 | 0 |
| 0.7819444444444444 | 0 |
| 0.782638888888889 | 0 |
| 0.7833333333333333 | 0 |
| 0.7840277777777778 | 0 |
| 0.7847222222222222 | 0 |
| 0.7854166666666668 | 0 |
| 0.7861111111111111 | 0 |
| 0.7868055555555555 | 0 |
| 0.7875 | 0 |
| 0.7881944444444445 | 0 |
| 0.7888888888888889 | 0 |
| 0.7895833333333333 | 0 |
| 0.7902777777777777 | 0 |
| 0.7909722222222223 | 0 |
| 0.7916666666666666 | 0 |
| 0.7923611111111111 | 0 |
| 0.7930555555555556 | 0 |
| 0.7937500000000001 | 0 |
| 0.7944444444444444 | 0 |
| 0.7951388888888888 | 0 |
| 0.7958333333333334 | 0 |
| 0.7965277777777778 | 0 |
| 0.7972222222222222 | 0 |
| 0.7979166666666666 | 0 |
| 0.7986111111111112 | 0 |
| 0.7993055555555556 | 0 |
| 0.7999999999999999 | 0 |
| 0.8006944444444444 | 0 |
| 0.8013888888888889 | 0 |
| 0.8020833333333334 | 0 |
| 0.8027777777777777 | 0 |
| 0.8034722222222223 | 0 |
| 0.8041666666666667 | 0 |
| 0.8048611111111111 | 0 |
| 0.8055555555555555 | 0 |
| 0.80625 | 0 |
| 0.8069444444444445 | 0 |
| 0.8076388888888889 | 0 |
| 0.8083333333333332 | 0 |
| 0.8090277777777778 | 0 |
| 0.8097222222222222 | 0 |
| 0.8104166666666667 | 0 |
| 0.811111111111111 | 0 |
| 0.8118055555555556 | 0 |
| 0.8125 | 0 |
| 0.8131944444444444 | 0 |
| 0.813888888888889 | 0 |
| 0.8145833333333333 | 0 |
| 0.8152777777777778 | 0 |
| 0.8159722222222222 | 0 |
| 0.8166666666666668 | 0 |
| 0.8173611111111111 | 0 |
| 0.8180555555555555 | 0 |
| 0.81875 | 0 |
| 0.8194444444444445 | 0 |
| 0.8201388888888889 | 0 |
| 0.8208333333333333 | 0 |
| 0.8215277777777777 | 0 |
| 0.8222222222222223 | 0 |
| 0.8229166666666666 | 0 |
| 0.8236111111111111 | 0 |
| 0.8243055555555556 | 0 |
| 0.8250000000000001 | 0 |
| 0.8256944444444444 | 0 |
| 0.8263888888888888 | 0 |
| 0.8270833333333334 | 0 |
| 0.8277777777777778 | 0 |
| 0.8284722222222222 | 0 |
| 0.8291666666666666 | 0 |
| 0.8298611111111112 | 0 |
| 0.8305555555555556 | 0 |
| 0.8312499999999999 | 0 |
| 0.8319444444444444 | 0 |
| 0.8326388888888889 | 0 |
| 0.8333333333333334 | 0 |
| 0.8340277777777777 | 0 |
| 0.8347222222222223 | 0 |
| 0.8354166666666667 | 0 |
| 0.8361111111111111 | 0 |
| 0.8368055555555555 | 0 |
| 0.8375 | 0 |
| 0.8381944444444445 | 0 |
| 0.8388888888888889 | 0 |
| 0.8395833333333332 | 0 |
| 0.8402777777777778 | 0 |
| 0.8409722222222222 | 0 |
| 0.8416666666666667 | 0 |
| 0.842361111111111 | 0 |
| 0.8430555555555556 | 0 |
| 0.84375 | 0 |
| 0.8444444444444444 | 0 |
| 0.845138888888889 | 0 |
| 0.8458333333333333 | 0 |
| 0.8465277777777778 | 0 |
| 0.8472222222222222 | 0 |
| 0.8479166666666668 | 0 |
| 0.8486111111111111 | 0 |
| 0.8493055555555555 | 0 |
| 0.85 | 0 |
| 0.8506944444444445 | 0 |
| 0.8513888888888889 | 0 |
| 0.8520833333333333 | 0 |
| 0.8527777777777777 | 0 |
| 0.8534722222222223 | 0 |
| 0.8541666666666666 | 0 |
| 0.8548611111111111 | 0 |
| 0.8555555555555556 | 0 |
| 0.8562500000000001 | 0 |
| 0.8569444444444444 | 0 |
| 0.8576388888888888 | 0 |
| 0.8583333333333334 | 0 |
| 0.8590277777777778 | 0 |
| 0.8597222222222222 | 0 |
| 0.8604166666666666 | 0 |
| 0.8611111111111112 | 0 |
| 0.8618055555555556 | 0 |
| 0.8624999999999999 | 0 |
| 0.8631944444444444 | 0 |
| 0.8638888888888889 | 0 |
| 0.8645833333333334 | 0 |
| 0.8652777777777777 | 0 |
| 0.8659722222222223 | 0 |
| 0.8666666666666667 | 0 |
| 0.8673611111111111 | 0 |
| 0.8680555555555555 | 0 |
| 0.86875 | 0 |
| 0.8694444444444445 | 0 |
| 0.8701388888888889 | 0 |
| 0.8708333333333332 | 0 |
| 0.8715277777777778 | 0 |
| 0.8722222222222222 | 0 |
| 0.8729166666666667 | 0 |
| 0.873611111111111 | 0 |
| 0.8743055555555556 | 0 |
| 0.875 | 0 |
| 0.8756944444444444 | 0 |
| 0.876388888888889 | 0 |
| 0.8770833333333333 | 0 |
| 0.8777777777777778 | 0 |
| 0.8784722222222222 | 0 |
| 0.8791666666666668 | 0 |
| 0.8798611111111111 | 0 |
| 0.8805555555555555 | 0 |
| 0.88125 | 0 |
| 0.8819444444444445 | 0 |
| 0.8826388888888889 | 0 |
| 0.8833333333333333 | 0 |
| 0.8840277777777777 | 0 |
| 0.8847222222222223 | 0 |
| 0.8854166666666666 | 0 |
| 0.8861111111111111 | 0 |
| 0.8868055555555556 | 0 |
| 0.8875000000000001 | 0 |
| 0.8881944444444444 | 0 |
| 0.8888888888888888 | 0 |
| 0.8895833333333334 | 0 |
| 0.8902777777777778 | 0 |
| 0.8909722222222222 | 0 |
| 0.8916666666666666 | 0 |
| 0.8923611111111112 | 0 |
| 0.8930555555555556 | 0 |
| 0.8937499999999999 | 0 |
| 0.8944444444444444 | 0 |
| 0.8951388888888889 | 0 |
| 0.8958333333333334 | 0 |
| 0.8965277777777777 | 0 |
| 0.8972222222222223 | 0 |
| 0.8979166666666667 | 0 |
| 0.8986111111111111 | 0 |
| 0.8993055555555555 | 0 |
| 0.9 | 0 |
| 0.9006944444444445 | 0 |
| 0.9013888888888889 | 0 |
| 0.9020833333333332 | 0 |
| 0.9027777777777778 | 0 |
| 0.9034722222222222 | 0 |
| 0.9041666666666667 | 0 |
| 0.904861111111111 | 0 |
| 0.9055555555555556 | 0 |
| 0.90625 | 0 |
| 0.9069444444444444 | 0 |
| 0.907638888888889 | 0 |
| 0.9083333333333333 | 0 |
| 0.9090277777777778 | 0 |
| 0.9097222222222222 | 0 |
| 0.9104166666666668 | 0 |
| 0.9111111111111111 | 0 |
| 0.9118055555555555 | 0 |
| 0.9125 | 0 |
| 0.9131944444444445 | 0 |
| 0.9138888888888889 | 0 |
| 0.9145833333333333 | 0 |
| 0.9152777777777777 | 0 |
| 0.9159722222222223 | 0 |
| 0.9166666666666666 | 0 |
| 0.9173611111111111 | 0 |
| 0.9180555555555556 | 0 |
| 0.9187500000000001 | 0 |
| 0.9194444444444444 | 0 |
| 0.9201388888888888 | 0 |
| 0.9208333333333334 | 0 |
| 0.9215277777777778 | 0 |
| 0.9222222222222222 | 0 |
| 0.9229166666666666 | 0 |
| 0.9236111111111112 | 0 |
| 0.9243055555555556 | 0 |
| 0.9249999999999999 | 0 |
| 0.9256944444444444 | 0 |
| 0.9263888888888889 | 0 |
| 0.9270833333333334 | 0 |
| 0.9277777777777777 | 0 |
| 0.9284722222222223 | 0 |
| 0.9291666666666667 | 0 |
| 0.9298611111111111 | 0 |
| 0.9305555555555555 | 0 |
| 0.93125 | 0 |
| 0.9319444444444445 | 0 |
| 0.9326388888888889 | 0 |
| 0.9333333333333332 | 0 |
| 0.9340277777777778 | 0 |
| 0.9347222222222222 | 0 |
| 0.9354166666666667 | 0 |
| 0.936111111111111 | 0 |
| 0.9368055555555556 | 0 |
| 0.9375 | 0 |
| 0.9381944444444444 | 0 |
| 0.938888888888889 | 0 |
| 0.9395833333333333 | 0 |
| 0.9402777777777778 | 0 |
| 0.9409722222222222 | 0 |
| 0.9416666666666668 | 0 |
| 0.9423611111111111 | 0 |
| 0.9430555555555555 | 0 |
| 0.94375 | 0 |
| 0.9444444444444445 | 0 |
| 0.9451388888888889 | 0 |
| 0.9458333333333333 | 0 |
| 0.9465277777777777 | 0 |
| 0.9472222222222223 | 0 |
| 0.9479166666666666 | 0 |
| 0.9486111111111111 | 0 |
| 0.9493055555555556 | 0 |
| 0.9500000000000001 | 0 |
| 0.9506944444444444 | 0 |
| 0.9513888888888888 | 0 |
| 0.9520833333333334 | 0 |
| 0.9527777777777778 | 0 |
| 0.9534722222222222 | 0 |
| 0.9541666666666666 | 0 |
| 0.9548611111111112 | 0 |
| 0.9555555555555556 | 0 |
| 0.9562499999999999 | 0 |
| 0.9569444444444444 | 0 |
| 0.9576388888888889 | 0 |
| 0.9583333333333334 | 0 |
| 0.9590277777777777 | 0 |
| 0.9597222222222223 | 0 |
| 0.9604166666666667 | 0 |
| 0.9611111111111111 | 0 |
| 0.9618055555555555 | 0 |
| 0.9625 | 0 |
| 0.9631944444444445 | 0 |
| 0.9638888888888889 | 0 |
| 0.9645833333333332 | 0 |
| 0.9652777777777778 | 0 |
| 0.9659722222222222 | 0 |
| 0.9666666666666667 | 0 |
| 0.967361111111111 | 0 |
| 0.9680555555555556 | 0 |
| 0.96875 | 0 |
| 0.9694444444444444 | 0 |
| 0.970138888888889 | 0 |
| 0.9708333333333333 | 0 |
| 0.9715277777777778 | 0 |
| 0.9722222222222222 | 0 |
| 0.9729166666666668 | 0 |
| 0.9736111111111111 | 0 |
| 0.9743055555555555 | 0 |
| 0.975 | 0 |
| 0.9756944444444445 | 0 |
| 0.9763888888888889 | 0 |
| 0.9770833333333333 | 0 |
| 0.9777777777777777 | 0 |
| 0.9784722222222223 | 0 |
| 0.9791666666666666 | 0 |
| 0.9798611111111111 | 0 |
| 0.9805555555555556 | 0 |
| 0.9812500000000001 | 0 |
| 0.9819444444444444 | 0 |
| 0.9826388888888888 | 0 |
| 0.9833333333333334 | 0 |
| 0.9840277777777778 | 0 |
| 0.9847222222222222 | 0 |
| 0.9854166666666666 | 0 |
| 0.9861111111111112 | 0 |
| 0.9868055555555556 | 0 |
| 0.9874999999999999 | 0 |
| 0.9881944444444444 | 0 |
| 0.9888888888888889 | 0 |
| 0.9895833333333334 | 0 |
| 0.9902777777777777 | 0 |
| 0.9909722222222223 | 0 |
| 0.9916666666666667 | 0 |
| 0.9923611111111111 | 0 |
| 0.9930555555555555 | 0 |
| 0.99375 | 0 |
| 0.9944444444444445 | 0 |
| 0.9951388888888889 | 0 |
| 0.9958333333333332 | 0 |
| 0.9965277777777778 | 0 |
| 0.9972222222222222 | 0 |
| 0.9979166666666667 | 0 |
| 0.998611111111111 | 0 |
| 0.9993055555555556 | 0 |